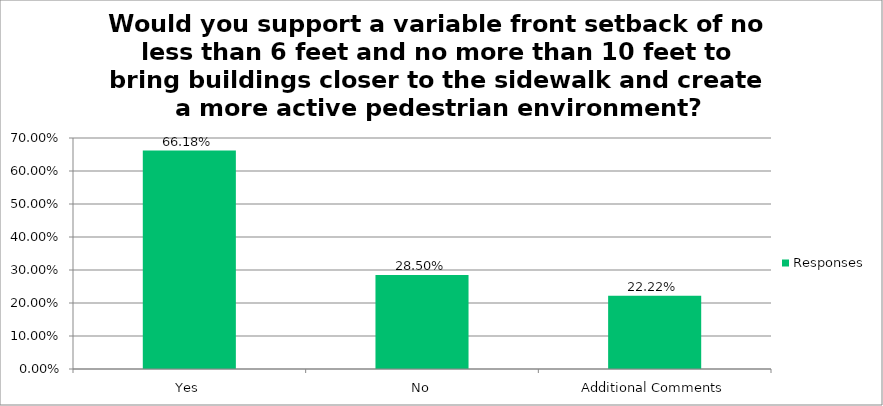
| Category | Responses |
|---|---|
| Yes | 0.662 |
| No | 0.285 |
| Additional Comments | 0.222 |